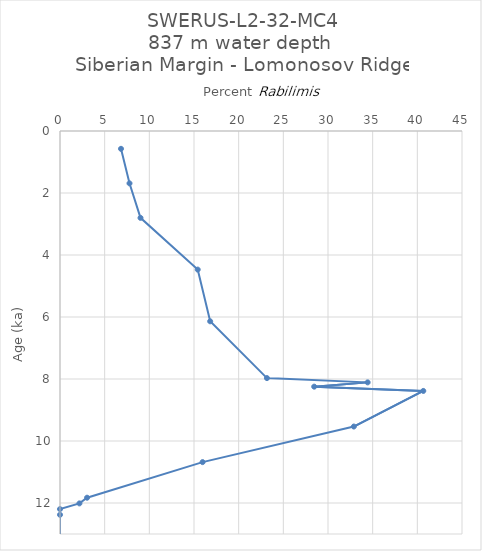
| Category | Series 0 |
|---|---|
| 6.8287037037037 | 0.575 |
| 7.7798861480075905 | 1.688 |
| 9.01213171577123 | 2.802 |
| 15.415821501014198 | 4.47 |
| 16.81109185441941 | 6.139 |
| 23.16715542521994 | 7.971 |
| 34.437086092715234 | 8.109 |
| 28.455284552845526 | 8.247 |
| 40.666666666666664 | 8.385 |
| 32.89036544850498 | 9.533 |
| 15.960912052117262 | 10.681 |
| 3.0303030303030303 | 11.829 |
| 2.1739130434782608 | 12.013 |
| 0.0 | 12.196 |
| 0.0 | 12.38 |
| 0.0 | 14.231 |
| 0.33333333333333337 | 16.083 |
| 0.0 | 17.934 |
| 0.33222591362126247 | 19.785 |
| 0.0 | 21.636 |
| 0.0 | 23.79 |
| 0.0 | 25.945 |
| 0.0 | 28.099 |
| 0.8670520231213872 | 30.253 |
| 0.3401360544217687 | 32.408 |
| 0.0 | 33.397 |
| 0.9966777408637874 | 34.387 |
| 1.5968063872255487 | 35.377 |
| 3.7848605577689245 | 36.367 |
| 6.291390728476822 | 37.356 |
| 8.57365549493375 | 38.346 |
| 16.938110749185668 | 39.336 |